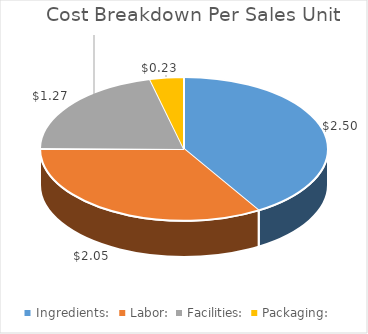
| Category | Series 0 |
|---|---|
| Ingredients:   | 2.496 |
| Labor:  | 2.047 |
| Facilities:  | 1.267 |
| Packaging:  | 0.23 |